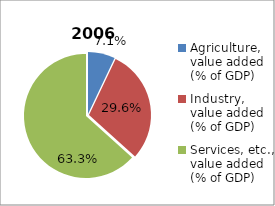
| Category | 2006 |
|---|---|
| Agriculture, value added (% of GDP)  | 7.058 |
| Industry, value added (% of GDP) | 29.618 |
| Services, etc., value added (% of GDP) | 63.324 |